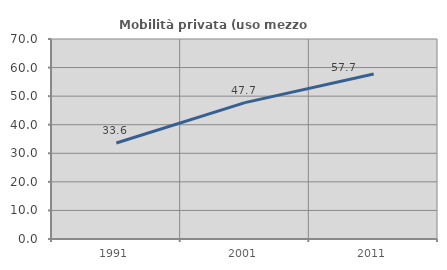
| Category | Mobilità privata (uso mezzo privato) |
|---|---|
| 1991.0 | 33.591 |
| 2001.0 | 47.733 |
| 2011.0 | 57.734 |